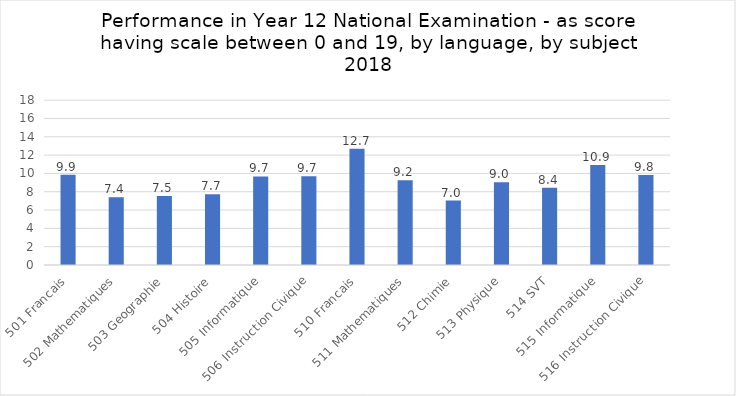
| Category | Series 0 |
|---|---|
| 501 Francais | 9.861 |
| 502 Mathematiques | 7.399 |
| 503 Geographie | 7.524 |
| 504 Histoire | 7.722 |
| 505 Informatique | 9.667 |
| 506 Instruction Civique | 9.696 |
| 510 Francais | 12.695 |
| 511 Mathematiques | 9.241 |
| 512 Chimie | 7.032 |
| 513 Physique | 9.036 |
| 514 SVT | 8.427 |
| 515 Informatique | 10.918 |
| 516 Instruction Civique | 9.832 |